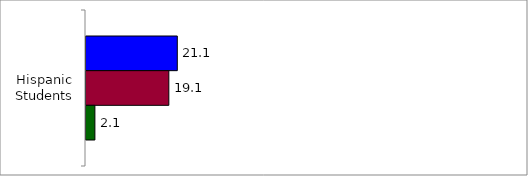
| Category | 50 States and D.C. | SREB States | State |
|---|---|---|---|
| 0 | 21.086 | 19.129 | 2.054 |